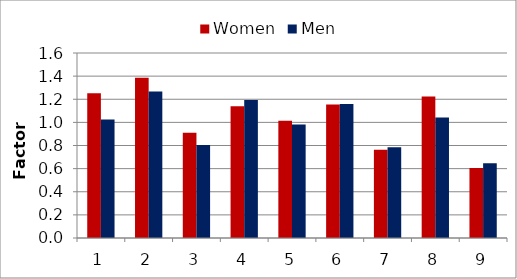
| Category | Women | Men |
|---|---|---|
| 1.0 | 1.251 | 1.024 |
| 2.0 | 1.385 | 1.266 |
| 3.0 | 0.911 | 0.805 |
| 4.0 | 1.139 | 1.193 |
| 5.0 | 1.015 | 0.982 |
| 6.0 | 1.155 | 1.159 |
| 7.0 | 0.764 | 0.785 |
| 8.0 | 1.224 | 1.043 |
| 9.0 | 0.606 | 0.647 |